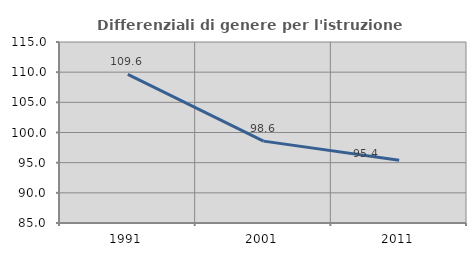
| Category | Differenziali di genere per l'istruzione superiore |
|---|---|
| 1991.0 | 109.627 |
| 2001.0 | 98.57 |
| 2011.0 | 95.395 |